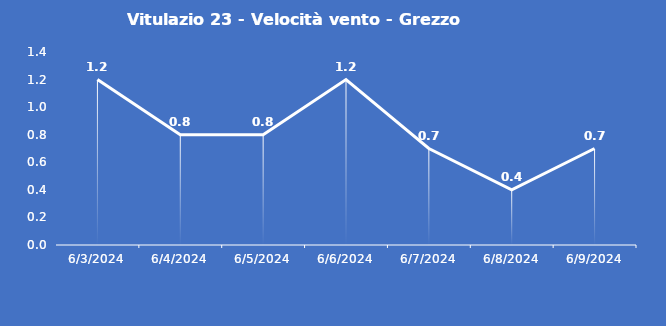
| Category | Vitulazio 23 - Velocità vento - Grezzo (m/s) |
|---|---|
| 6/3/24 | 1.2 |
| 6/4/24 | 0.8 |
| 6/5/24 | 0.8 |
| 6/6/24 | 1.2 |
| 6/7/24 | 0.7 |
| 6/8/24 | 0.4 |
| 6/9/24 | 0.7 |